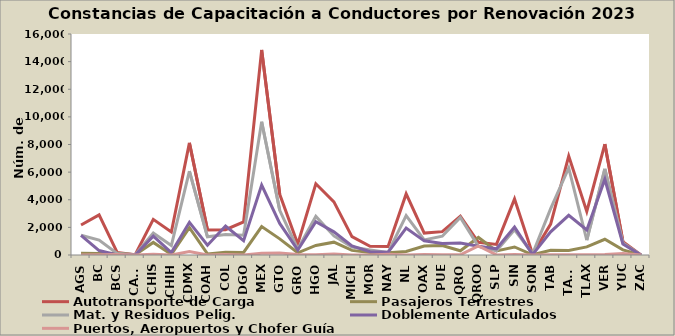
| Category | Autotransporte de Carga | Pasajeros Terrestres | Mat. y Residuos Pelig. | Doblemente Articulados | Puertos, Aeropuertos y Chofer Guía |
|---|---|---|---|---|---|
| AGS | 2170 | 131 | 1432 | 1424 | 5 |
| BC | 2906 | 104 | 1085 | 322 | 22 |
| BCS | 183 | 135 | 107 | 0 | 32 |
| CAMP | 17 | 17 | 18 | 0 | 2 |
| CHIS | 2580 | 911 | 1593 | 1368 | 48 |
| CHIH | 1669 | 42 | 685 | 173 | 1 |
| CDMX | 8119 | 1984 | 6079 | 2365 | 246 |
| COAH | 1818 | 81 | 1318 | 707 | 0 |
| COL | 1830 | 195 | 1482 | 2095 | 34 |
| DGO | 2398 | 186 | 1432 | 1034 | 6 |
| MEX | 14844 | 2062 | 9650 | 5060 | 125 |
| GTO | 4396 | 1170 | 3235 | 2284 | 152 |
| GRO | 795 | 159 | 439 | 356 | 29 |
| HGO | 5154 | 693 | 2796 | 2405 | 16 |
| JAL | 3848 | 929 | 1380 | 1674 | 65 |
| MICH | 1332 | 335 | 574 | 652 | 0 |
| MOR | 631 | 174 | 367 | 242 | 6 |
| NAY | 624 | 161 | 188 | 194 | 58 |
| NL | 4424 | 253 | 2851 | 1950 | 9 |
| OAX | 1586 | 645 | 1092 | 1024 | 31 |
| PUE | 1692 | 692 | 1359 | 835 | 13 |
| QRO | 2812 | 308 | 2714 | 861 | 17 |
| QROO | 918 | 1269 | 624 | 641 | 654 |
| SLP | 767 | 298 | 307 | 451 | 6 |
| SIN | 4055 | 582 | 1828 | 2019 | 32 |
| SON | 77 | 13 | 89 | 29 | 2 |
| TAB | 2240 | 342 | 3359 | 1674 | 24 |
| TAMS | 7164 | 323 | 6300 | 2871 | 11 |
| TLAX | 3149 | 584 | 1082 | 1810 | 12 |
| VER | 8026 | 1140 | 6234 | 5483 | 35 |
| YUC | 968 | 370 | 868 | 795 | 101 |
| ZAC | 0 | 0 | 0 | 0 | 0 |